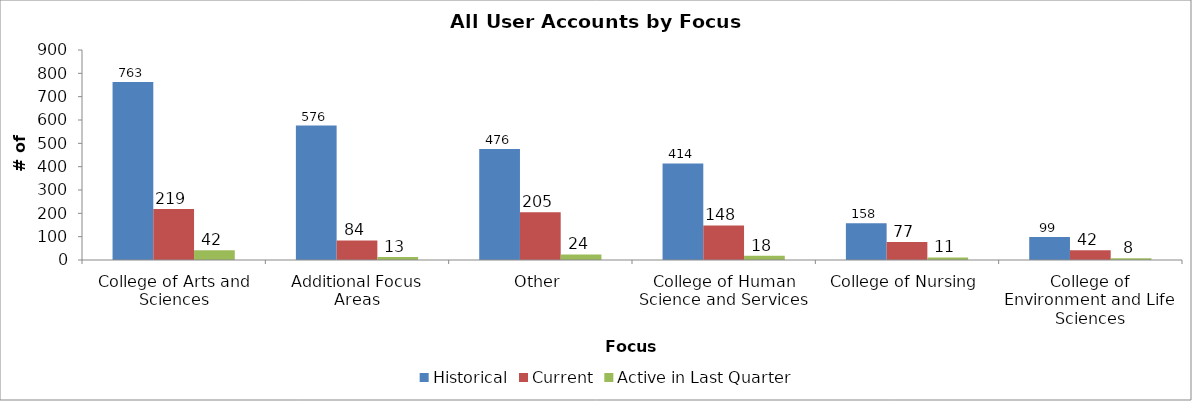
| Category | Historical | Current | Active in Last Quarter |
|---|---|---|---|
| College of Arts and Sciences | 763 | 219 | 42 |
| Additional Focus Areas | 576 | 84 | 13 |
| Other | 476 | 205 | 24 |
| College of Human Science and Services | 414 | 148 | 18 |
| College of Nursing | 158 | 77 | 11 |
| College of Environment and Life Sciences | 99 | 42 | 8 |